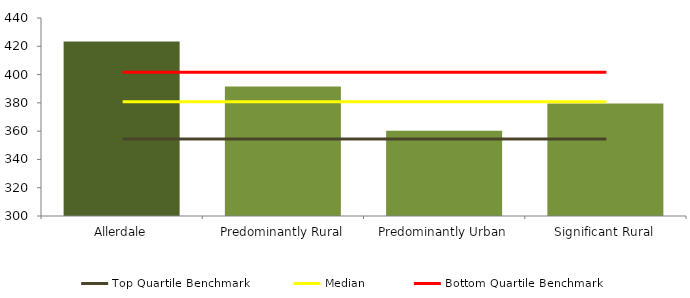
| Category | Series 0 |
|---|---|
| Allerdale | 423.4 |
| Predominantly Rural | 391.494 |
| Predominantly Urban | 360.193 |
| Significant Rural | 379.585 |